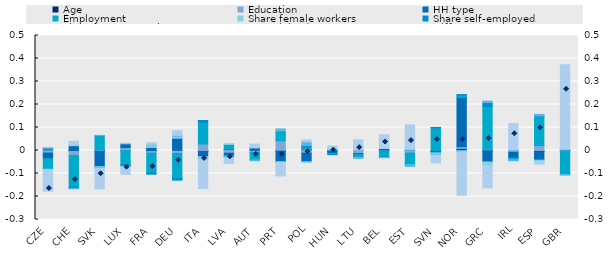
| Category | Age | Education | HH type | Employment | Share female workers | Share self-employed | Share insecure workers | Unexplained |
|---|---|---|---|---|---|---|---|---|
| CZE | 0 | -0.011 | -0.025 | -0.046 | 0.002 | 0.007 | 0.002 | -0.095 |
| CHE | -0.002 | -0.019 | 0.021 | -0.138 | 0.004 | -0.005 | -0.002 | 0.015 |
| SVK | 0.002 | -0.004 | -0.066 | 0.064 | -0.005 | 0 | 0.001 | -0.091 |
| LUX | -0.001 | 0.012 | 0.017 | -0.062 | 0.002 | -0.006 | -0.002 | -0.034 |
| FRA | -0.003 | -0.008 | 0.013 | -0.087 | 0.011 | -0.005 | 0.003 | 0.007 |
| DEU | 0.001 | -0.013 | 0.053 | -0.109 | 0.009 | -0.008 | 0.003 | 0.021 |
| ITA | -0.004 | 0.028 | -0.023 | 0.096 | -0.012 | 0.007 | 0 | -0.125 |
| LVA | 0.005 | -0.012 | -0.009 | 0.021 | 0.002 | -0.004 | -0.008 | -0.024 |
| AUT | 0.001 | -0.008 | 0.011 | -0.031 | 0.001 | -0.001 | -0.004 | 0.015 |
| PRT | -0.003 | 0.042 | -0.045 | 0.044 | 0.002 | -0.001 | 0.005 | -0.061 |
| POL | 0.004 | -0.011 | -0.037 | 0.012 | -0.002 | 0.005 | 0.017 | 0.008 |
| HUN | 0 | 0.001 | -0.013 | 0.003 | -0.001 | -0.003 | 0.001 | 0.015 |
| LTU | 0.003 | -0.013 | -0.004 | -0.008 | 0.002 | -0.003 | -0.006 | 0.041 |
| BEL | -0.002 | 0.001 | 0.007 | -0.026 | 0.002 | -0.002 | -0.001 | 0.057 |
| EST | 0.001 | -0.011 | 0.001 | -0.049 | 0.006 | 0 | -0.008 | 0.104 |
| SVN | -0.002 | -0.001 | -0.007 | 0.099 | -0.007 | 0.001 | -0.003 | -0.033 |
| NOR | 0.008 | 0.009 | 0.214 | 0.011 | -0.001 | 0.002 | -0.004 | -0.19 |
| GRC | -0.001 | 0.006 | -0.048 | 0.186 | -0.015 | 0.016 | 0.006 | -0.097 |
| IRL | -0.001 | -0.007 | -0.025 | -0.009 | -0.001 | 0.001 | -0.002 | 0.116 |
| ESP | -0.006 | 0.022 | -0.036 | 0.125 | -0.006 | 0.003 | 0.007 | -0.011 |
| GBR | 0.001 | -0.002 | 0.002 | -0.097 | 0.007 | -0.004 | -0.005 | 0.363 |